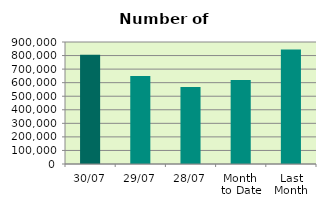
| Category | Series 0 |
|---|---|
| 30/07 | 805878 |
| 29/07 | 648510 |
| 28/07 | 568862 |
| Month 
to Date | 619837.182 |
| Last
Month | 844726.818 |